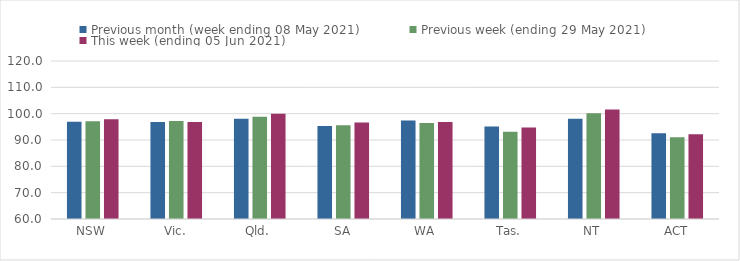
| Category | Previous month (week ending 08 May 2021) | Previous week (ending 29 May 2021) | This week (ending 05 Jun 2021) |
|---|---|---|---|
| NSW | 96.89 | 97.13 | 97.86 |
| Vic. | 96.81 | 97.18 | 96.86 |
| Qld. | 98.04 | 98.86 | 99.94 |
| SA | 95.36 | 95.57 | 96.61 |
| WA | 97.45 | 96.48 | 96.84 |
| Tas. | 95.14 | 93.12 | 94.77 |
| NT | 98.03 | 100.16 | 101.62 |
| ACT | 92.61 | 91.08 | 92.22 |